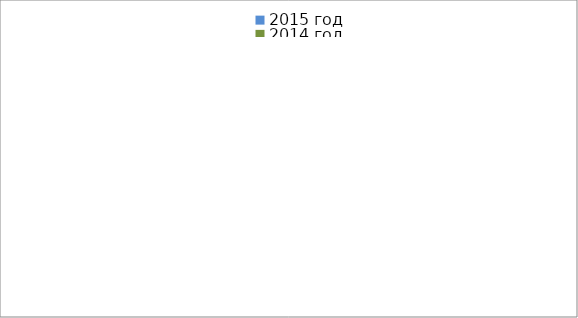
| Category | 2015 год | 2014 год |
|---|---|---|
|  - поджог | 2 | 3 |
|  - неосторожное обращение с огнём | 20 | 10 |
|  - НПТЭ электрооборудования | 2 | 4 |
|  - НПУ и Э печей | 17 | 29 |
|  - НПУ и Э транспортных средств | 26 | 30 |
|   -Шалость с огнем детей | 0 | 0 |
|  -НППБ при эксплуатации эл.приборов | 8 | 10 |
|  - курение | 7 | 4 |
| - прочие | 35 | 41 |
| - не установленные причины | 2 | 5 |